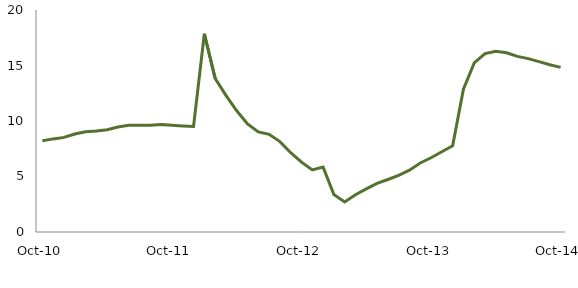
| Category | Series 0 |
|---|---|
| Oct-10 | 8.224 |
|  | 8.388 |
|  | 8.524 |
|  | 8.833 |
|  | 9.026 |
|  | 9.09 |
|  | 9.208 |
|  | 9.462 |
|  | 9.609 |
|  | 9.617 |
|  | 9.625 |
|  | 9.681 |
| Oct-11 | 9.607 |
|  | 9.549 |
|  | 9.507 |
|  | 17.862 |
|  | 13.836 |
|  | 12.306 |
|  | 10.924 |
|  | 9.737 |
|  | 9.012 |
|  | 8.798 |
|  | 8.145 |
|  | 7.143 |
| Oct-12 | 6.29 |
|  | 5.588 |
|  | 5.848 |
|  | 3.372 |
|  | 2.709 |
|  | 3.357 |
|  | 3.88 |
|  | 4.386 |
|  | 4.728 |
|  | 5.103 |
|  | 5.569 |
|  | 6.219 |
| Oct-13 | 6.691 |
|  | 7.233 |
|  | 7.764 |
|  | 12.871 |
|  | 15.229 |
|  | 16.075 |
|  | 16.29 |
|  | 16.142 |
|  | 15.823 |
|  | 15.617 |
|  | 15.35 |
|  | 15.064 |
| Oct-14 | 14.828 |